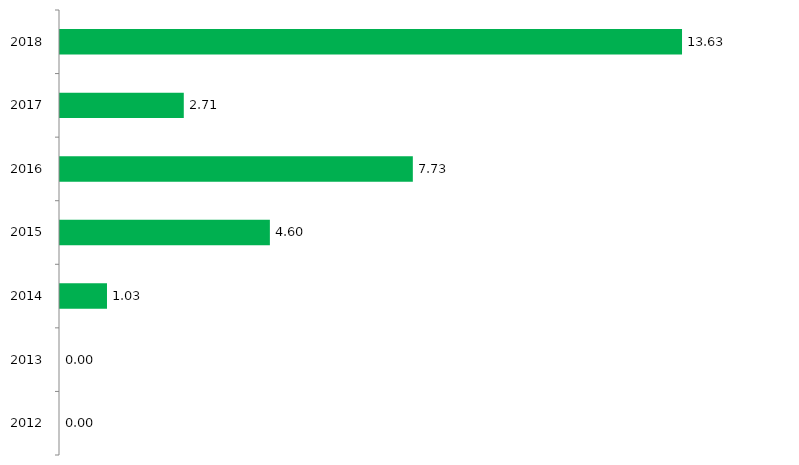
| Category | Concorrência |
|---|---|
| 2012.0 | 0 |
| 2013.0 | 0 |
| 2014.0 | 1.03 |
| 2015.0 | 4.6 |
| 2016.0 | 7.733 |
| 2017.0 | 2.713 |
| 2018.0 | 13.633 |